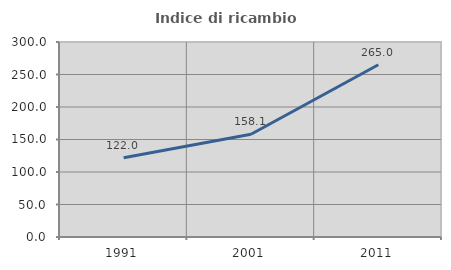
| Category | Indice di ricambio occupazionale  |
|---|---|
| 1991.0 | 122.034 |
| 2001.0 | 158.095 |
| 2011.0 | 265 |